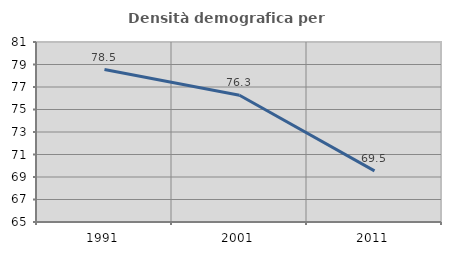
| Category | Densità demografica |
|---|---|
| 1991.0 | 78.549 |
| 2001.0 | 76.265 |
| 2011.0 | 69.54 |